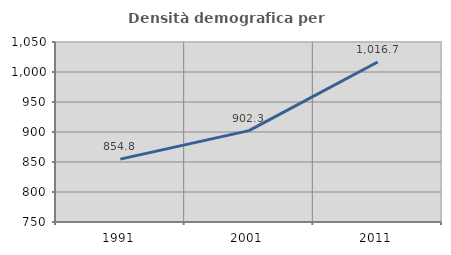
| Category | Densità demografica |
|---|---|
| 1991.0 | 854.833 |
| 2001.0 | 902.336 |
| 2011.0 | 1016.735 |